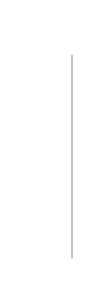
| Category | Series 0 |
|---|---|
| 2.0 | 2 |
| 2.0 | 0.1 |